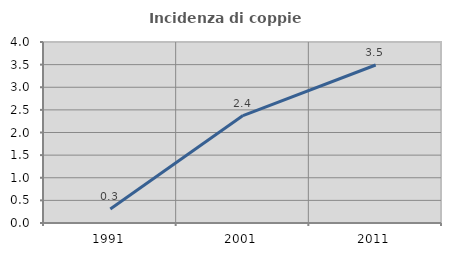
| Category | Incidenza di coppie miste |
|---|---|
| 1991.0 | 0.307 |
| 2001.0 | 2.374 |
| 2011.0 | 3.491 |